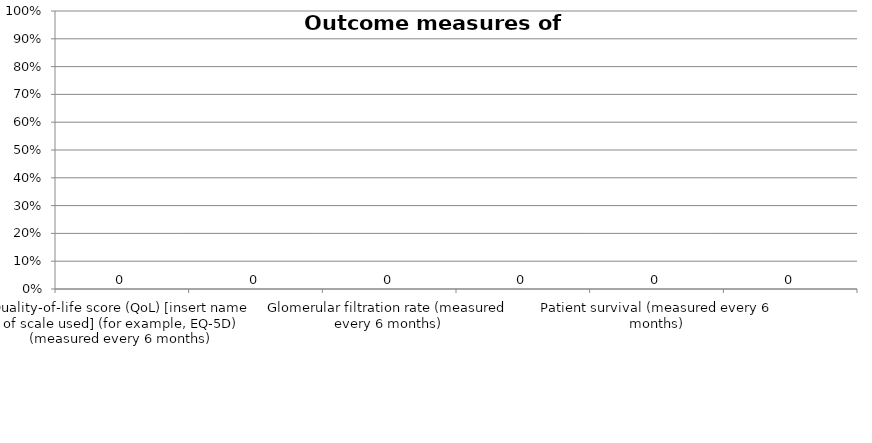
| Category | Series 0 |
|---|---|
| Quality-of-life score (QoL) [insert name of scale used] (for example, EQ-5D) (measured every 6 months) | 0 |
| Serum creatinine (measured every 6 months) | 0 |
| Glomerular filtration rate (measured every 6 months) | 0 |
| Graft survival (measured every 6 months) | 0 |
| Patient survival (measured every 6 months) | 0 |
| Other outcome measure of benefit (measured every 6 months) | 0 |